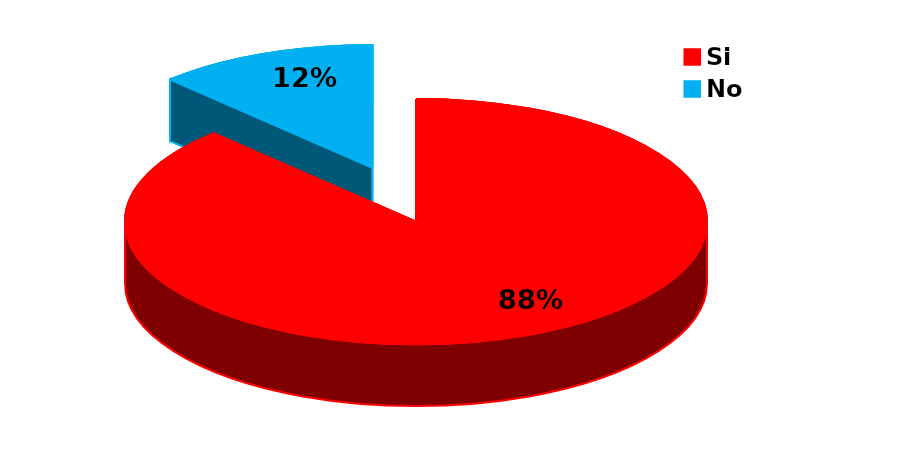
| Category | Series 0 |
|---|---|
| Si | 165 |
| No | 23 |